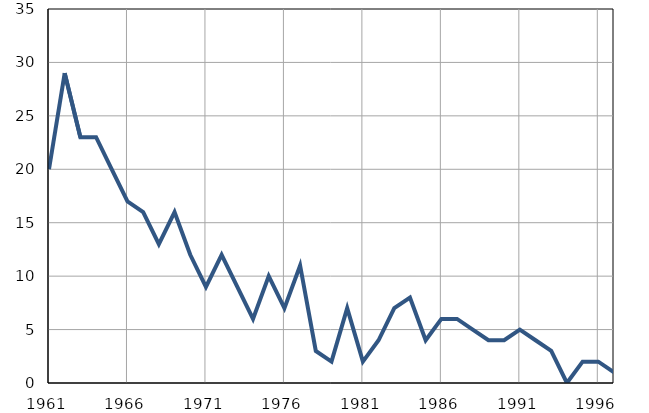
| Category | Умрла 
одојчад |
|---|---|
| 1961.0 | 20 |
| 1962.0 | 29 |
| 1963.0 | 23 |
| 1964.0 | 23 |
| 1965.0 | 20 |
| 1966.0 | 17 |
| 1967.0 | 16 |
| 1968.0 | 13 |
| 1969.0 | 16 |
| 1970.0 | 12 |
| 1971.0 | 9 |
| 1972.0 | 12 |
| 1973.0 | 9 |
| 1974.0 | 6 |
| 1975.0 | 10 |
| 1976.0 | 7 |
| 1977.0 | 11 |
| 1978.0 | 3 |
| 1979.0 | 2 |
| 1980.0 | 7 |
| 1981.0 | 2 |
| 1982.0 | 4 |
| 1983.0 | 7 |
| 1984.0 | 8 |
| 1985.0 | 4 |
| 1986.0 | 6 |
| 1987.0 | 6 |
| 1988.0 | 5 |
| 1989.0 | 4 |
| 1990.0 | 4 |
| 1991.0 | 5 |
| 1992.0 | 4 |
| 1993.0 | 3 |
| 1994.0 | 0 |
| 1995.0 | 2 |
| 1996.0 | 2 |
| 1997.0 | 1 |